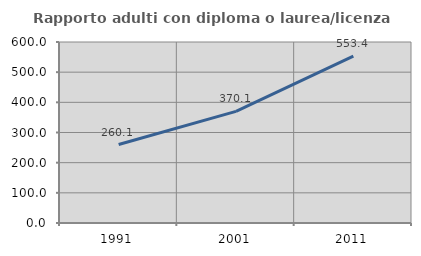
| Category | Rapporto adulti con diploma o laurea/licenza media  |
|---|---|
| 1991.0 | 260.125 |
| 2001.0 | 370.127 |
| 2011.0 | 553.395 |